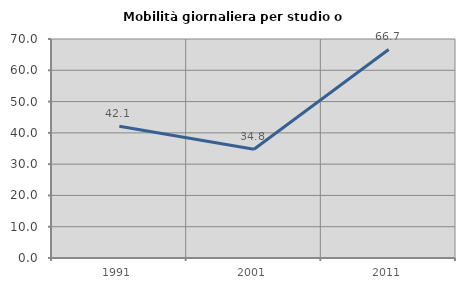
| Category | Mobilità giornaliera per studio o lavoro |
|---|---|
| 1991.0 | 42.105 |
| 2001.0 | 34.783 |
| 2011.0 | 66.667 |